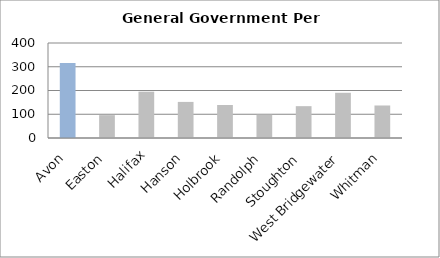
| Category | Series 0 |
|---|---|
| Avon | 316.011 |
| Easton | 96.316 |
| Halifax | 195.06 |
| Hanson | 151.947 |
| Holbrook | 139.028 |
| Randolph | 98.214 |
| Stoughton | 134.059 |
| West Bridgewater | 190.369 |
| Whitman | 136.907 |